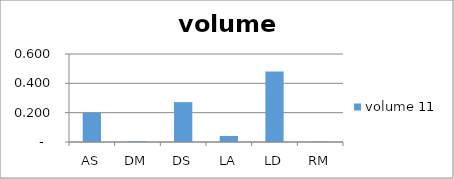
| Category |  volume 11  |
|---|---|
| AS | 0.199 |
| DM | 0.005 |
| DS | 0.272 |
| LA | 0.041 |
| LD | 0.48 |
| RM | 0.003 |